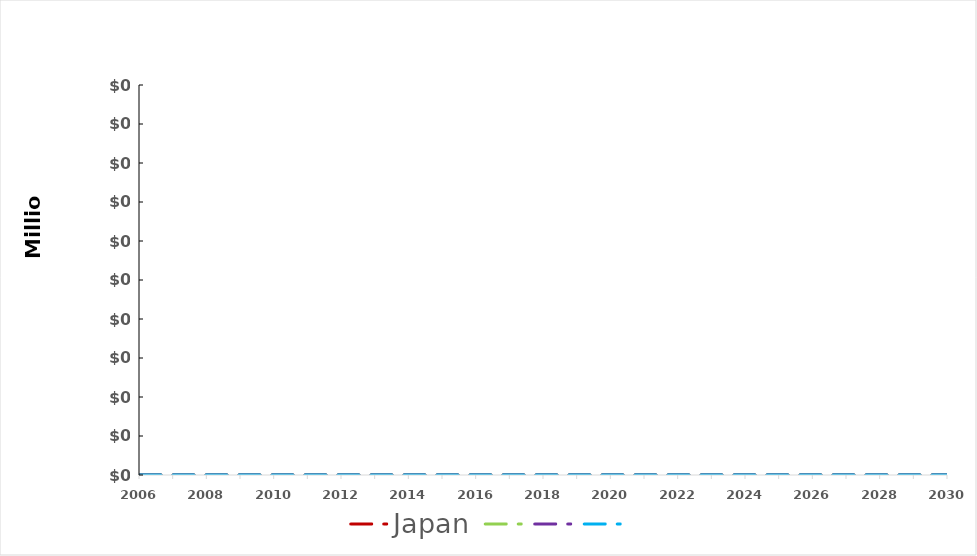
| Category | Japan | Series 3 | Series 4 | Series 0 |
|---|---|---|---|---|
| 2006.0 | 0 | 0 | 0 | 0 |
| 2007.0 | 0 | 0 | 0 | 0 |
| 2008.0 | 0 | 0 | 0 | 0 |
| 2009.0 | 0 | 0 | 0 | 0 |
| 2010.0 | 0 | 0 | 0 | 0 |
| 2011.0 | 0 | 0 | 0 | 0 |
| 2012.0 | 0 | 0 | 0 | 0 |
| 2013.0 | 0 | 0 | 0 | 0 |
| 2014.0 | 0 | 0 | 0 | 0 |
| 2015.0 | 0 | 0 | 0 | 0 |
| 2016.0 | 0 | 0 | 0 | 0 |
| 2017.0 | 0 | 0 | 0 | 0 |
| 2018.0 | 0 | 0 | 0 | 0 |
| 2019.0 | 0 | 0 | 0 | 0 |
| 2020.0 | 0 | 0 | 0 | 0 |
| 2021.0 | 0 | 0 | 0 | 0 |
| 2022.0 | 0 | 0 | 0 | 0 |
| 2023.0 | 0 | 0 | 0 | 0 |
| 2024.0 | 0 | 0 | 0 | 0 |
| 2025.0 | 0 | 0 | 0 | 0 |
| 2026.0 | 0 | 0 | 0 | 0 |
| 2027.0 | 0 | 0 | 0 | 0 |
| 2028.0 | 0 | 0 | 0 | 0 |
| 2029.0 | 0 | 0 | 0 | 0 |
| 2030.0 | 0 | 0 | 0 | 0 |